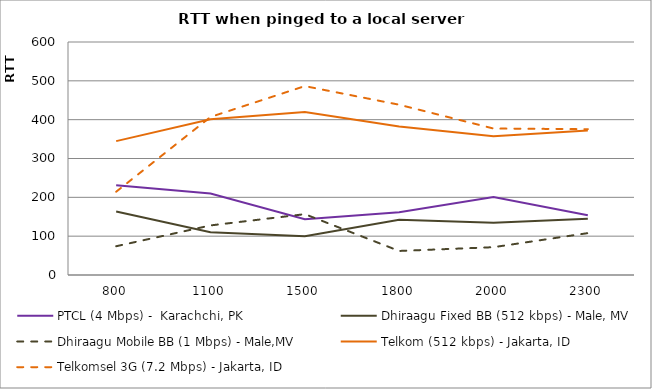
| Category | PTCL (4 Mbps) -  Karachchi, PK | Dhiraagu Fixed BB (512 kbps) - Male, MV | Dhiraagu Mobile BB (1 Mbps) - Male,MV | Telkom (512 kbps) - Jakarta, ID | Telkomsel 3G (7.2 Mbps) - Jakarta, ID |
|---|---|---|---|---|---|
| 800.0 | 231.333 | 163.5 | 74.071 | 344.8 | 214.4 |
| 1100.0 | 210 | 110.308 | 127.667 | 401 | 407 |
| 1500.0 | 143.727 | 99.733 | 156.667 | 419.5 | 486.4 |
| 1800.0 | 161.429 | 142 | 61.917 | 382.333 | 438.5 |
| 2000.0 | 201 | 134.583 | 71.615 | 357.5 | 377.2 |
| 2300.0 | 153.6 | 145 | 107.846 | 372.25 | 375.5 |